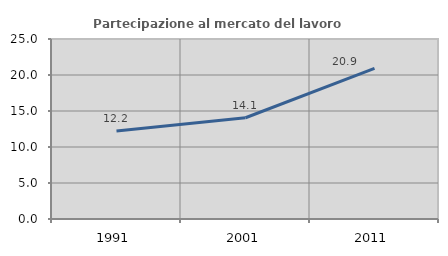
| Category | Partecipazione al mercato del lavoro  femminile |
|---|---|
| 1991.0 | 12.222 |
| 2001.0 | 14.062 |
| 2011.0 | 20.93 |